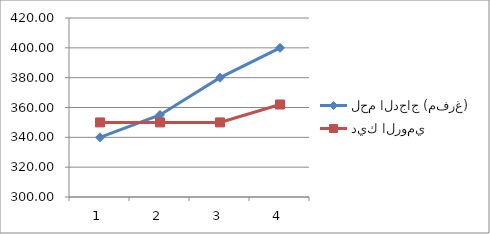
| Category | لحم الدجاج (مفرغ) | ديك الرومي |
|---|---|---|
| 0 | 340 | 350 |
| 1 | 355 | 350 |
| 2 | 380 | 350 |
| 3 | 400 | 362 |